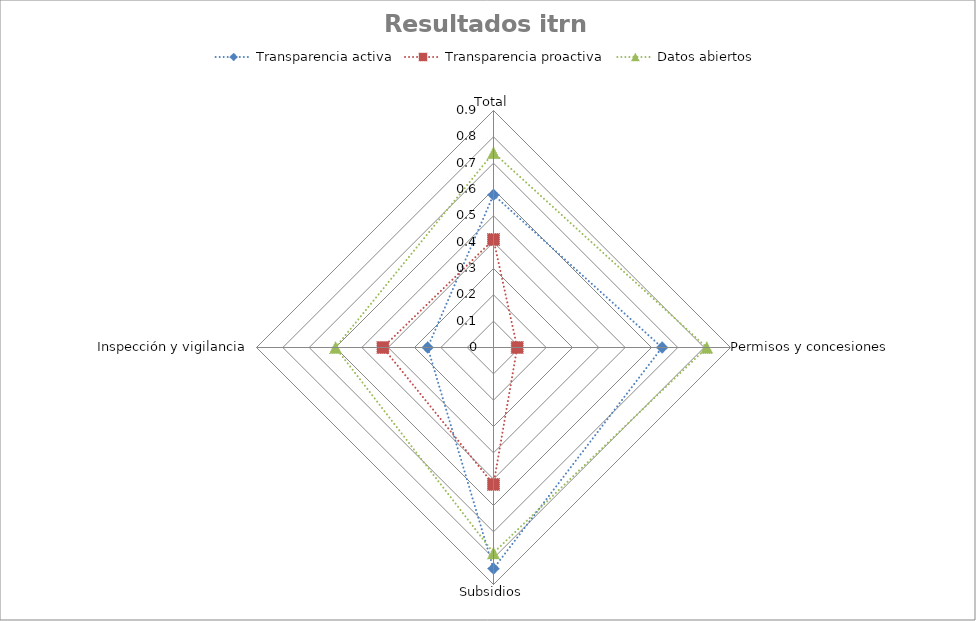
| Category | Transparencia activa | Transparencia proactiva | Datos abiertos |
|---|---|---|---|
| Total | 0.58 | 0.41 | 0.74 |
| Permisos y concesiones  | 0.64 | 0.09 | 0.81 |
| Subsidios | 0.84 | 0.52 | 0.78 |
| Inspección y vigilancia  | 0.25 | 0.42 | 0.6 |